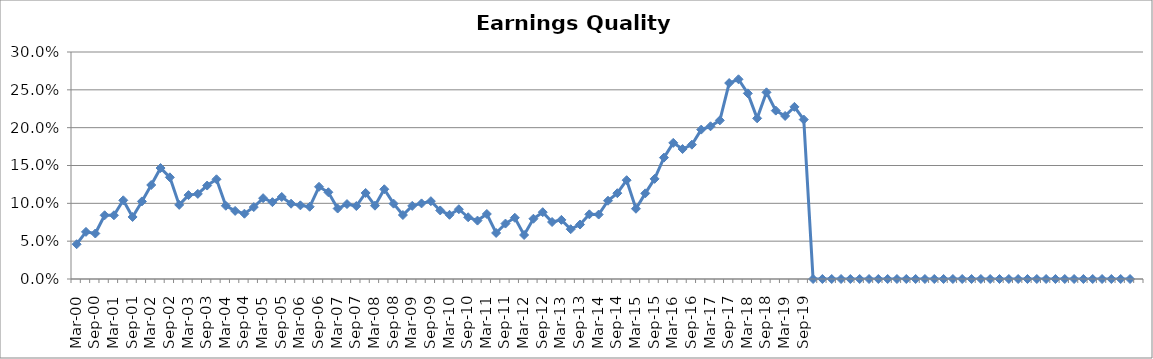
| Category | Rptd. Earnings Quality Indicator |
|---|---|
| Mar-00 | 0.046 |
| Jun-00 | 0.062 |
| Sep-00 | 0.06 |
| Dec-00 | 0.084 |
| Mar-01 | 0.084 |
| Jun-01 | 0.104 |
| Sep-01 | 0.082 |
| Dec-01 | 0.103 |
| Mar-02 | 0.124 |
| Jun-02 | 0.147 |
| Sep-02 | 0.134 |
| Dec-02 | 0.098 |
| Mar-03 | 0.111 |
| Jun-03 | 0.112 |
| Sep-03 | 0.123 |
| Dec-03 | 0.132 |
| Mar-04 | 0.097 |
| Jun-04 | 0.09 |
| Sep-04 | 0.086 |
| Dec-04 | 0.095 |
| Mar-05 | 0.107 |
| Jun-05 | 0.102 |
| Sep-05 | 0.108 |
| Dec-05 | 0.1 |
| Mar-06 | 0.097 |
| Jun-06 | 0.095 |
| Sep-06 | 0.122 |
| Dec-06 | 0.115 |
| Mar-07 | 0.093 |
| Jun-07 | 0.099 |
| Sep-07 | 0.096 |
| Dec-07 | 0.114 |
| Mar-08 | 0.097 |
| Jun-08 | 0.119 |
| Sep-08 | 0.1 |
| Dec-08 | 0.085 |
| Mar-09 | 0.097 |
| Jun-09 | 0.1 |
| Sep-09 | 0.103 |
| Dec-09 | 0.091 |
| Mar-10 | 0.085 |
| Jun-10 | 0.092 |
| Sep-10 | 0.082 |
| Dec-10 | 0.077 |
| Mar-11 | 0.086 |
| Jun-11 | 0.061 |
| Sep-11 | 0.073 |
| Dec-11 | 0.081 |
| Mar-12 | 0.058 |
| Jun-12 | 0.08 |
| Sep-12 | 0.088 |
| Dec-12 | 0.075 |
| Mar-13 | 0.078 |
| Jun-13 | 0.066 |
| Sep-13 | 0.072 |
| Dec-13 | 0.085 |
| Mar-14 | 0.085 |
| Jun-14 | 0.103 |
| Sep-14 | 0.113 |
| Dec-14 | 0.131 |
| Mar-15 | 0.093 |
| Jun-15 | 0.113 |
| Sep-15 | 0.132 |
| Dec-15 | 0.16 |
| Mar-16 | 0.18 |
| Jun-16 | 0.172 |
| Sep-16 | 0.178 |
| Dec-16 | 0.197 |
| Mar-17 | 0.202 |
| Jun-17 | 0.21 |
| Sep-17 | 0.259 |
| Dec-17 | 0.264 |
| Mar-18 | 0.245 |
| Jun-18 | 0.212 |
| Sep-18 | 0.247 |
| Dec-18 | 0.223 |
| Mar-19 | 0.215 |
| Jun-19 | 0.228 |
| Sep-19 | 0.211 |